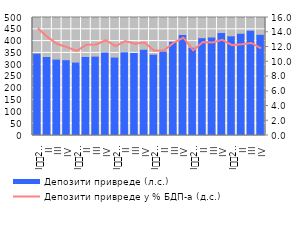
| Category | Депозити привреде (л.с.) |
|---|---|
| I
2008. | 344.733 |
| II | 330.438 |
| III | 319.486 |
| IV | 316.985 |
| I
2009. | 306.942 |
| II | 330.657 |
| III | 332.158 |
| IV | 349.542 |
| I
2010. | 328.124 |
| II | 350.604 |
| III | 347.698 |
| IV | 361.017 |
| I
2011. | 340.301 |
| II | 353.218 |
| III | 394.629 |
| IV | 423.268 |
| I
2012. | 369.515 |
| II | 410.212 |
| III | 412.972 |
| IV | 431.876 |
| I
2013. | 418.238 |
| II | 428.599 |
| III | 442.244 |
| IV | 424.635 |